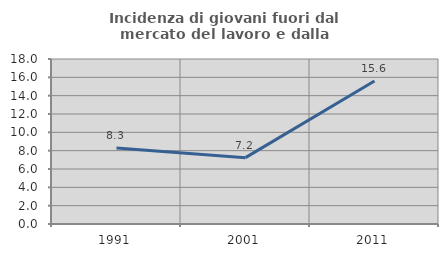
| Category | Incidenza di giovani fuori dal mercato del lavoro e dalla formazione  |
|---|---|
| 1991.0 | 8.293 |
| 2001.0 | 7.237 |
| 2011.0 | 15.591 |